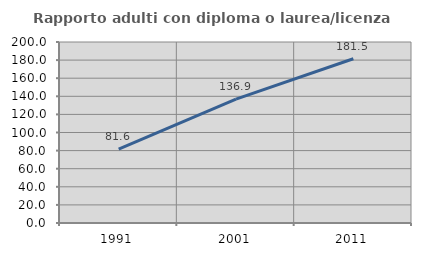
| Category | Rapporto adulti con diploma o laurea/licenza media  |
|---|---|
| 1991.0 | 81.579 |
| 2001.0 | 136.89 |
| 2011.0 | 181.493 |